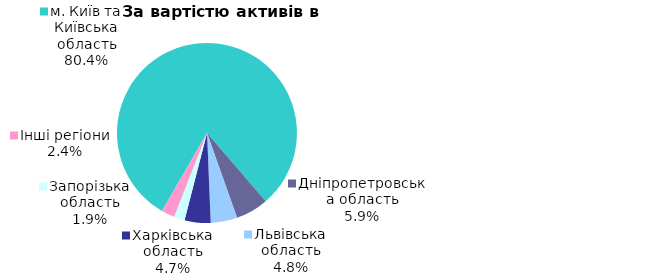
| Category | Series 0 |
|---|---|
| м. Київ та Київська область | 0.804 |
| Дніпропетровська область | 0.059 |
| Львівська область | 0.048 |
| Харківська область | 0.047 |
| Запорізька область | 0.019 |
| Інші регіони | 0.024 |